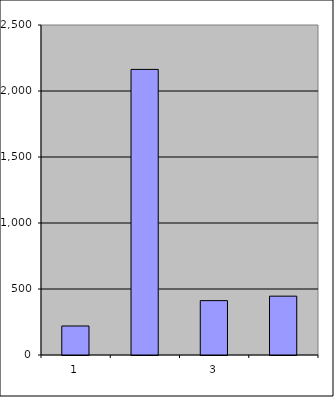
| Category | Series 0 |
|---|---|
| 0 | 219.75 |
| 1 | 2163.493 |
| 2 | 411.904 |
| 3 | 445.697 |